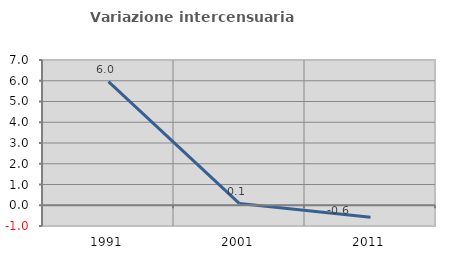
| Category | Variazione intercensuaria annua |
|---|---|
| 1991.0 | 5.954 |
| 2001.0 | 0.08 |
| 2011.0 | -0.58 |